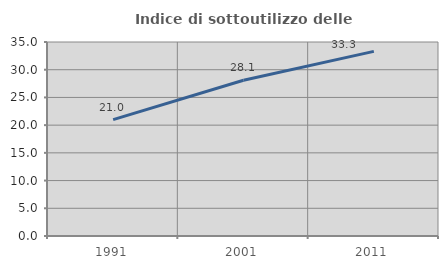
| Category | Indice di sottoutilizzo delle abitazioni  |
|---|---|
| 1991.0 | 20.986 |
| 2001.0 | 28.11 |
| 2011.0 | 33.311 |